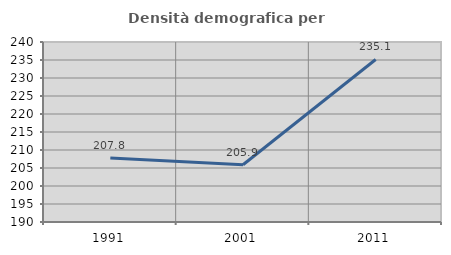
| Category | Densità demografica |
|---|---|
| 1991.0 | 207.769 |
| 2001.0 | 205.914 |
| 2011.0 | 235.14 |